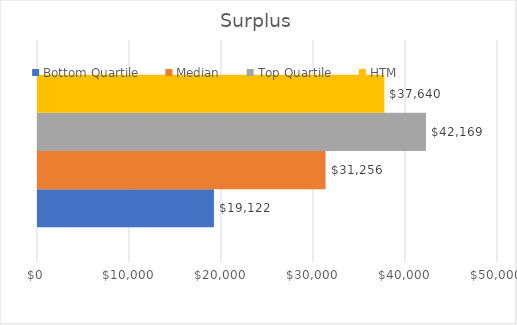
| Category | Bottom Quartile | Median | Top Quartile | HTM  |
|---|---|---|---|---|
| 0 | 19122 | 31256 | 42169 | 37640 |